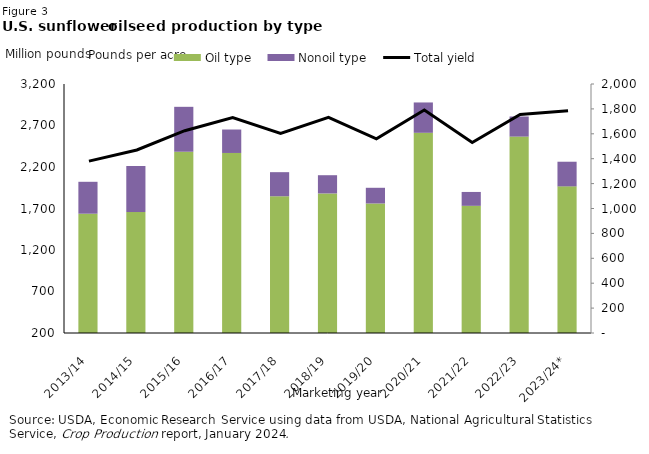
| Category | Oil type | Nonoil type |
|---|---|---|
| 2013/14 | 1637.205 | 384.56 |
| 2014/15 | 1657.39 | 554.96 |
| 2015/16 | 2383.87 | 541.16 |
| 2016/17 | 2369.015 | 282.62 |
| 2017/18 | 1847.525 | 290.225 |
| 2018/19 | 1881.31 | 219.785 |
| 2019/20 | 1760.45 | 189.085 |
| 2020/21 | 2612.07 | 365.55 |
| 2021/22 | 1732.27 | 167.125 |
| 2022/23 | 2566.4 | 242.155 |
| 2023/24* | 1966.715 | 296.805 |